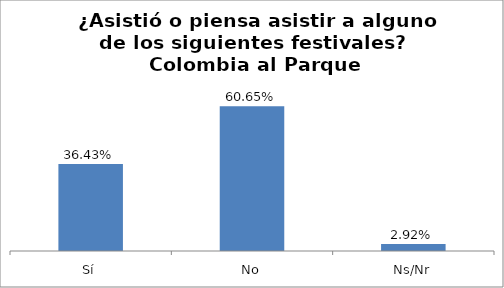
| Category | Total |
|---|---|
| Sí | 0.364 |
| No | 0.606 |
| Ns/Nr | 0.029 |